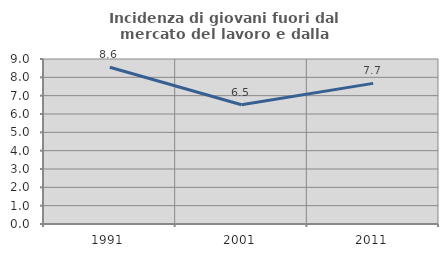
| Category | Incidenza di giovani fuori dal mercato del lavoro e dalla formazione  |
|---|---|
| 1991.0 | 8.553 |
| 2001.0 | 6.504 |
| 2011.0 | 7.67 |